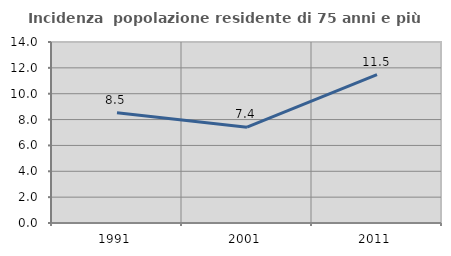
| Category | Incidenza  popolazione residente di 75 anni e più |
|---|---|
| 1991.0 | 8.534 |
| 2001.0 | 7.412 |
| 2011.0 | 11.477 |